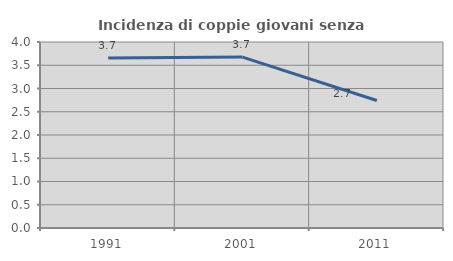
| Category | Incidenza di coppie giovani senza figli |
|---|---|
| 1991.0 | 3.654 |
| 2001.0 | 3.676 |
| 2011.0 | 2.741 |